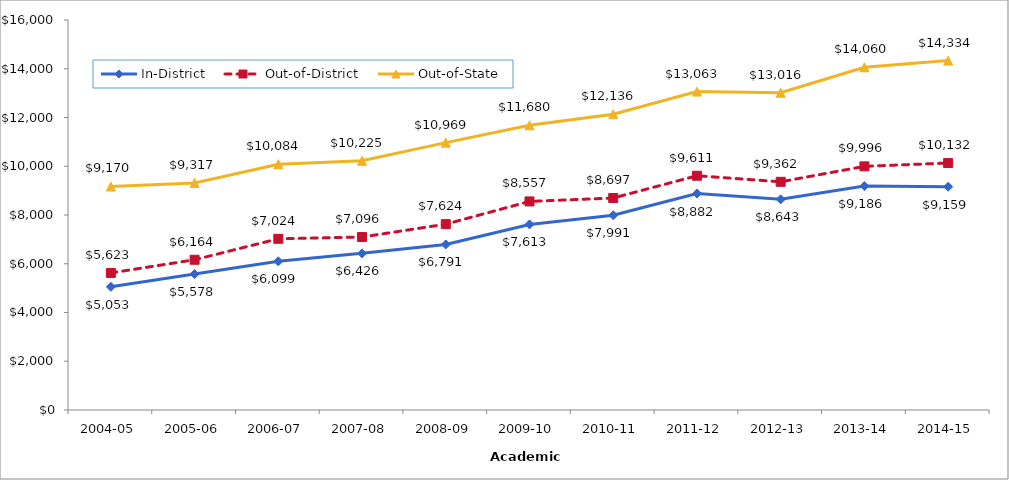
| Category | In-District | Out-of-District | Out-of-State |
|---|---|---|---|
| 2004-05 | 5053 | 5623 | 9170 |
| 2005-06 | 5578 | 6164 | 9317 |
| 2006-07 | 6099 | 7024 | 10084 |
| 2007-08 | 6426 | 7096 | 10225 |
| 2008-09 | 6791 | 7624 | 10969 |
| 2009-10 | 7613 | 8557 | 11680 |
| 2010-11 | 7991 | 8697 | 12136 |
| 2011-12 | 8882 | 9611 | 13063 |
| 2012-13 | 8643.15 | 9362 | 13016 |
| 2013-14 | 9185.83 | 9996.06 | 14060.13 |
| 2014-15 | 9159.04 | 10132.13 | 14333.65 |